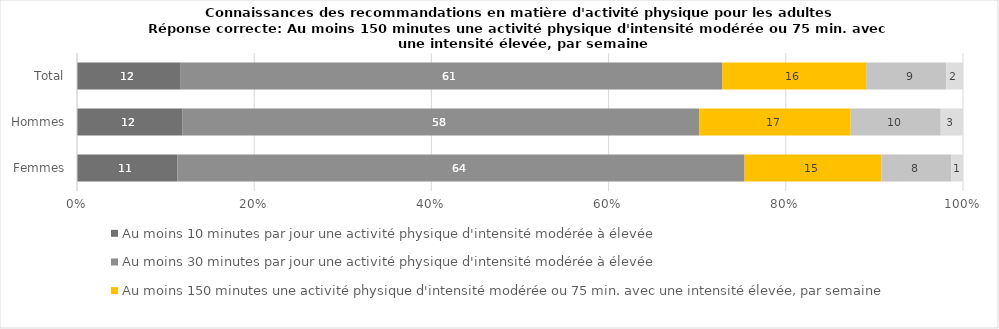
| Category | Au moins 10 minutes par jour une activité physique d'intensité modérée à élevée | Au moins 30 minutes par jour une activité physique d'intensité modérée à élevée | Au moins 150 minutes une activité physique d'intensité modérée ou 75 min. avec une intensité élevée, par semaine | Au moins 150-300 minutes une activité physique d'intensité modérée ou 75-150 min. avec une intensité élevée, par semaine | Au moins 420 minutes une activité physique d'intensité modérée ou élevée, par semaine |
|---|---|---|---|---|---|
| Total | 11.6 | 61 | 16.2 | 9 | 1.9 |
| Hommes | 11.8 | 58 | 17 | 10.1 | 2.5 |
| Femmes | 11.3 | 63.9 | 15.4 | 7.9 | 1.3 |